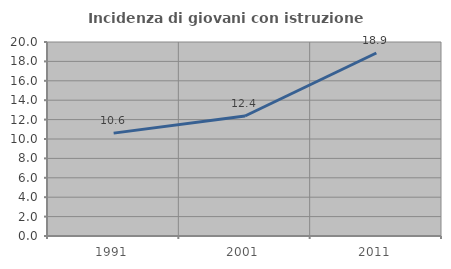
| Category | Incidenza di giovani con istruzione universitaria |
|---|---|
| 1991.0 | 10.606 |
| 2001.0 | 12.371 |
| 2011.0 | 18.868 |